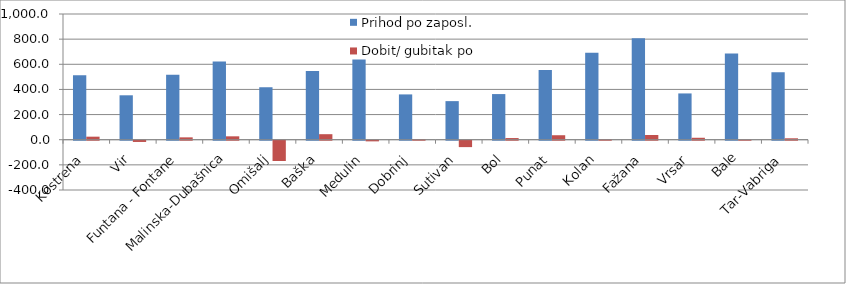
| Category | Prihod po zaposl. | Dobit/ gubitak po zaposl. |
|---|---|---|
| Kostrena | 511.91 | 24.212 |
| Vir | 353.355 | -9.934 |
| Funtana - Fontane | 516.975 | 18.754 |
| Malinska-Dubašnica | 622.748 | 27.017 |
| Omišalj | 417.347 | -161.27 |
| Baška | 546.03 | 43.968 |
| Medulin | 638.958 | -5.13 |
| Dobrinj | 360.368 | 5.778 |
| Sutivan | 306.974 | -50.902 |
| Bol | 363.07 | 13.248 |
| Punat | 555.293 | 35.674 |
| Kolan | 691.342 | 3.987 |
| Fažana | 806.207 | 37.463 |
| Vrsar | 368.141 | 15.502 |
| Bale | 685.764 | 0.947 |
| Tar-Vabriga | 535.694 | 11.319 |